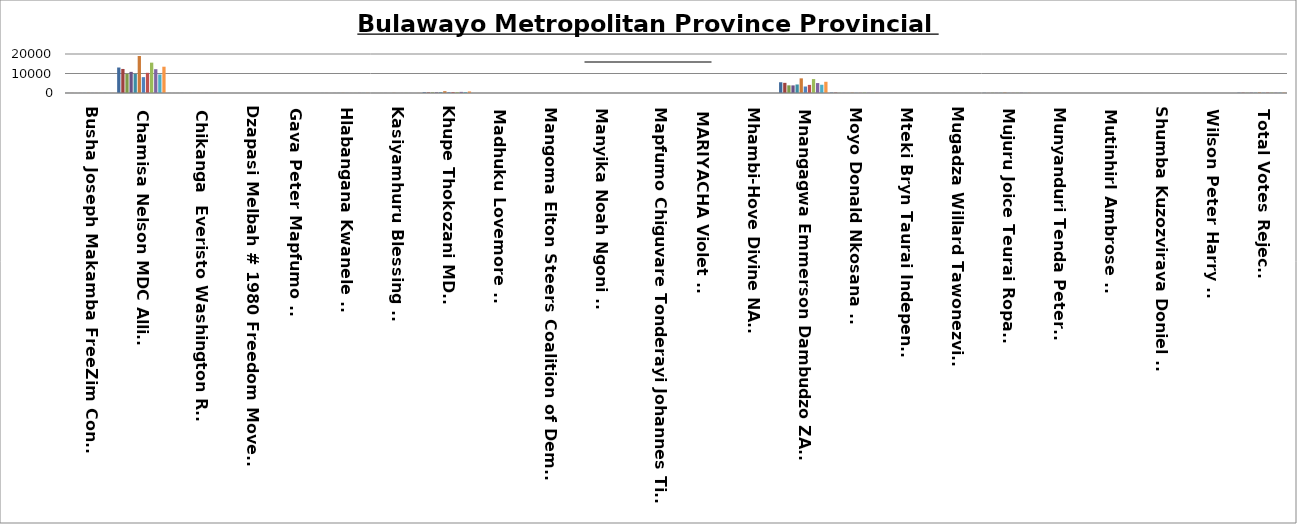
| Category | Candidates | Series 1 | Series 2 | Series 3 | Series 4 | Series 5 | Series 6 | Series 7 | Series 8 | Series 9 | Series 10 | Series 11 |
|---|---|---|---|---|---|---|---|---|---|---|---|---|
| Busha Joseph Makamba FreeZim Congress | 33 | 37 | 21 | 34 | 38 | 65 | 41 | 35 | 58 | 48 | 38 | 49 |
| Chamisa Nelson MDC Alliance | 13071 | 12334 | 9853 | 10837 | 9814 | 18971 | 8127 | 10342 | 15562 | 12212 | 9504 | 13480 |
| Chikanga  Everisto Washington Rebuild Zimbabwe | 29 | 19 | 25 | 32 | 24 | 42 | 26 | 26 | 32 | 35 | 27 | 47 |
| Dzapasi Melbah # 1980 Freedom Movement Zimbabwe | 14 | 8 | 2 | 8 | 8 | 12 | 5 | 10 | 7 | 5 | 7 | 8 |
| Gava Peter Mapfumo UDF | 6 | 3 | 3 | 9 | 4 | 14 | 9 | 3 | 9 | 5 | 2 | 11 |
| Hlabangana Kwanele RPZ | 30 | 28 | 15 | 29 | 47 | 59 | 30 | 18 | 38 | 51 | 41 | 56 |
| Kasiyamhuru Blessing ZPP | 18 | 14 | 23 | 26 | 14 | 67 | 15 | 21 | 49 | 19 | 15 | 39 |
| Khupe Thokozani MDC-T | 361 | 317 | 308 | 325 | 378 | 934 | 409 | 450 | 428 | 581 | 456 | 806 |
| Madhuku Lovemore NCA | 5 | 7 | 1 | 9 | 5 | 13 | 8 | 7 | 5 | 6 | 5 | 10 |
| Mangoma Elton Steers Coalition of Democrats | 5 | 3 | 3 | 3 | 6 | 9 | 6 | 6 | 4 | 2 | 8 | 5 |
| Manyika Noah Ngoni BZA | 20 | 17 | 8 | 4 | 8 | 9 | 1 | 7 | 13 | 5 | 6 | 6 |
| Mapfumo Chiguvare Tonderayi Johannes Timothy PPPZ | 10 | 3 | 4 | 3 | 5 | 5 | 0 | 3 | 2 | 2 | 2 | 6 |
| MARIYACHA Violet UDM | 6 | 1 | 2 | 4 | 14 | 8 | 5 | 3 | 4 | 3 | 3 | 12 |
| Mhambi-Hove Divine NAPDR | 1 | 7 | 1 | 2 | 5 | 10 | 2 | 3 | 10 | 6 | 3 | 7 |
| Mnangagwa Emmerson Dambudzo ZANU PF | 5514 | 5209 | 3939 | 3907 | 4373 | 7511 | 3328 | 4164 | 7141 | 5099 | 4232 | 5751 |
| Moyo Donald Nkosana APA | 219 | 213 | 77 | 62 | 66 | 158 | 74 | 65 | 168 | 91 | 66 | 91 |
| Mteki Bryn Taurai Independent | 11 | 2 | 3 | 3 | 6 | 9 | 6 | 2 | 5 | 3 | 4 | 14 |
| Mugadza Willard Tawonezvi BCP | 27 | 20 | 16 | 15 | 15 | 25 | 14 | 16 | 31 | 17 | 15 | 20 |
| Mujuru Joice Teurai Ropa PRC | 98 | 42 | 108 | 76 | 86 | 192 | 46 | 59 | 110 | 125 | 43 | 65 |
| Munyanduri Tenda Peter NPF | 11 | 7 | 6 | 7 | 14 | 15 | 10 | 15 | 11 | 12 | 5 | 20 |
| MutinhirI Ambrose NDP | 11 | 5 | 10 | 14 | 2 | 8 | 9 | 1 | 8 | 10 | 5 | 8 |
| Shumba Kuzozvirava Doniel UDA | 7 | 20 | 5 | 7 | 13 | 18 | 12 | 3 | 12 | 7 | 5 | 9 |
| Wilson Peter Harry DOP | 11 | 9 | 5 | 13 | 17 | 11 | 10 | 11 | 13 | 5 | 11 | 13 |
| Total Votes Rejected  | 152 | 151 | 112 | 152 | 133 | 251 | 113 | 177 | 203 | 125 | 144 | 188 |